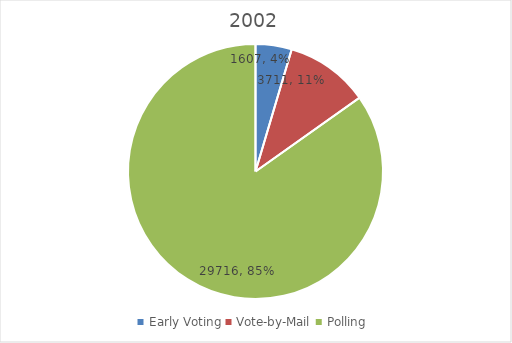
| Category | Series 0 |
|---|---|
| Early Voting | 1607 |
| Vote-by-Mail | 3711 |
| Polling | 29716 |